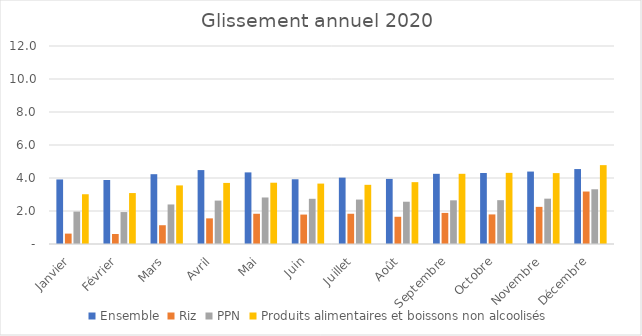
| Category |  Ensemble  |  Riz  |  PPN  |  Produits alimentaires et boissons non alcoolisés  |
|---|---|---|---|---|
| Janvier | 3.912 | 0.63 | 1.964 | 3.016 |
| Février | 3.88 | 0.606 | 1.936 | 3.088 |
| Mars | 4.231 | 1.138 | 2.397 | 3.551 |
| Avril | 4.48 | 1.553 | 2.631 | 3.702 |
| Mai | 4.34 | 1.833 | 2.819 | 3.714 |
| Juin | 3.924 | 1.783 | 2.74 | 3.661 |
| Juillet | 4.022 | 1.833 | 2.693 | 3.587 |
| Août | 3.945 | 1.65 | 2.562 | 3.748 |
| Septembre | 4.254 | 1.884 | 2.647 | 4.254 |
| Octobre | 4.302 | 1.792 | 2.657 | 4.312 |
| Novembre | 4.39 | 2.251 | 2.748 | 4.296 |
| Décembre | 4.542 | 3.18 | 3.317 | 4.779 |